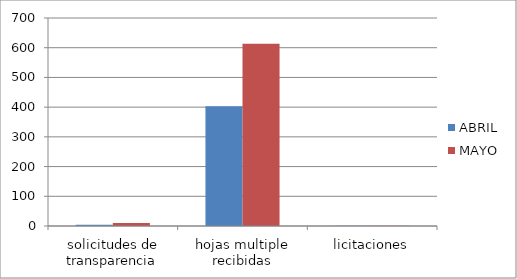
| Category | ABRIL | MAYO |
|---|---|---|
| solicitudes de transparencia | 4 | 10 |
| hojas multiple recibidas | 403 | 613 |
| licitaciones | 1 | 1 |